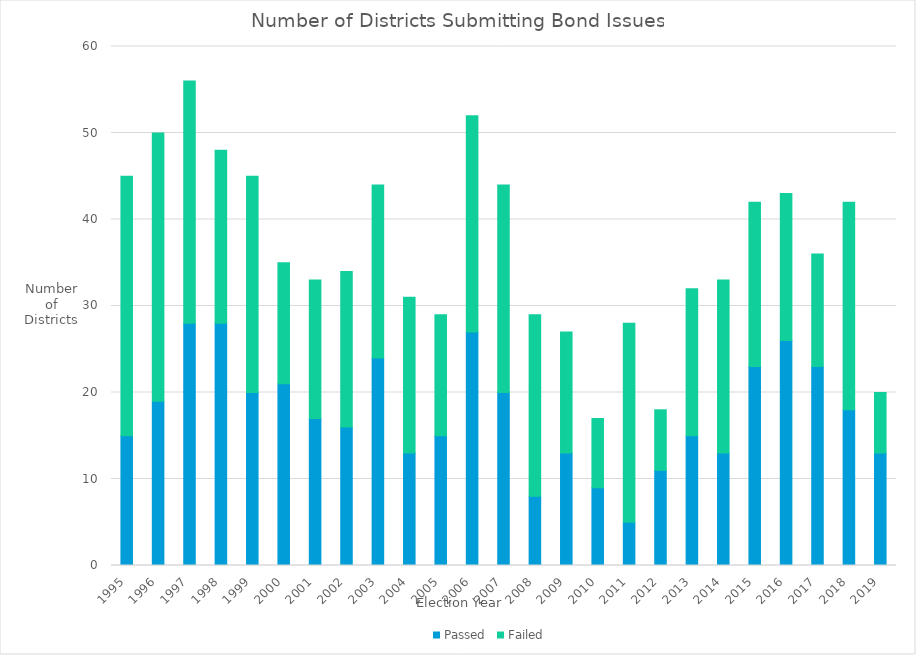
| Category | Passed | Failed |
|---|---|---|
| 1995 | 15 | 30 |
| 1996 | 19 | 31 |
| 1997 | 28 | 28 |
| 1998 | 28 | 20 |
| 1999 | 20 | 25 |
| 2000 | 21 | 14 |
| 2001 | 17 | 16 |
| 2002 | 16 | 18 |
| 2003 | 24 | 20 |
| 2004 | 13 | 18 |
| 2005 | 15 | 14 |
| 2006 | 27 | 25 |
| 2007 | 20 | 24 |
| 2008 | 8 | 21 |
| 2009 | 13 | 14 |
| 2010 | 9 | 8 |
| 2011 | 5 | 23 |
| 2012 | 11 | 7 |
| 2013 | 15 | 17 |
| 2014 | 13 | 20 |
| 2015 | 23 | 19 |
| 2016 | 26 | 17 |
| 2017 | 23 | 13 |
| 2018 | 18 | 24 |
| 2019 | 13 | 7 |